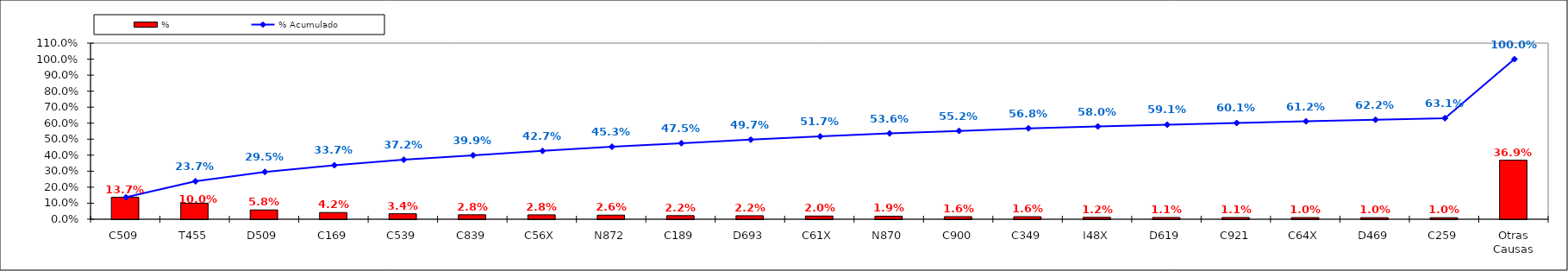
| Category | % |
|---|---|
| C509 | 0.137 |
| T455 | 0.1 |
| D509 | 0.058 |
| C169 | 0.042 |
| C539 | 0.034 |
| C839 | 0.028 |
| C56X | 0.028 |
| N872 | 0.026 |
| C189 | 0.022 |
| D693 | 0.022 |
| C61X | 0.02 |
| N870 | 0.019 |
| C900 | 0.016 |
| C349 | 0.016 |
| I48X | 0.012 |
| D619 | 0.011 |
| C921 | 0.011 |
| C64X | 0.01 |
| D469 | 0.01 |
| C259 | 0.01 |
| Otras Causas | 0.369 |